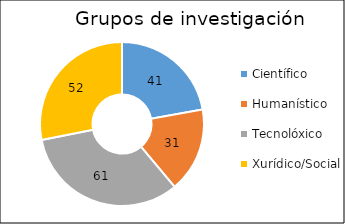
| Category | nº de grupos de investigación |
|---|---|
| Científico | 41 |
| Humanístico | 31 |
| Tecnolóxico | 61 |
| Xurídico/Social | 52 |